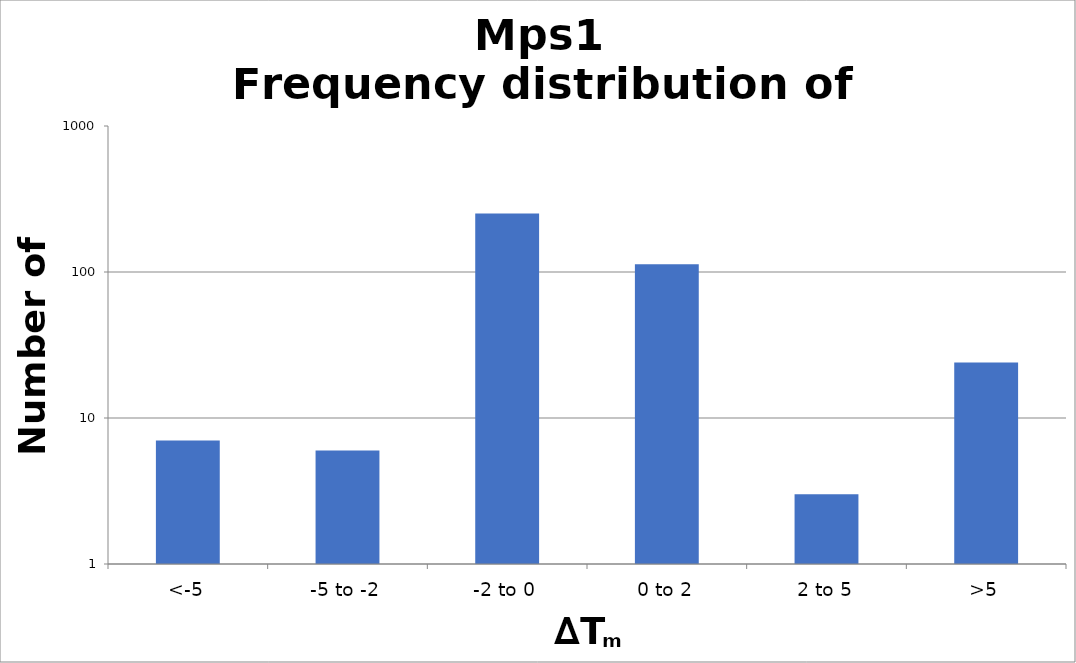
| Category | Series 0 |
|---|---|
| <-5 | 7 |
| -5 to -2 | 6 |
| -2 to 0 | 252 |
| 0 to 2 | 113 |
| 2 to 5 | 3 |
| >5 | 24 |